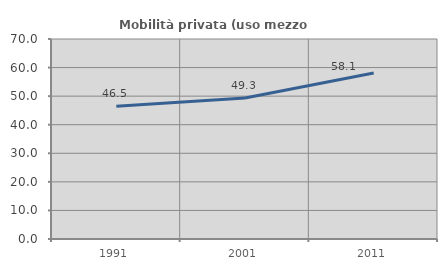
| Category | Mobilità privata (uso mezzo privato) |
|---|---|
| 1991.0 | 46.481 |
| 2001.0 | 49.336 |
| 2011.0 | 58.099 |